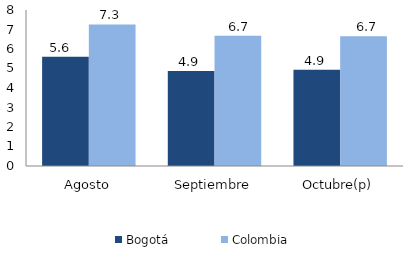
| Category | Bogotá | Colombia |
|---|---|---|
| Agosto | 5.608 | 7.258 |
| Septiembre | 4.874 | 6.68 |
| Octubre(p) | 4.93 | 6.659 |